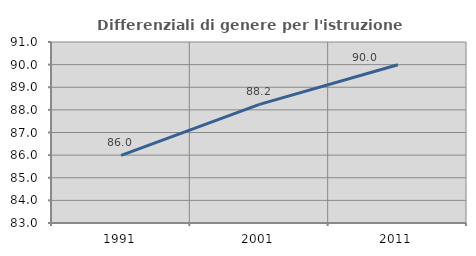
| Category | Differenziali di genere per l'istruzione superiore |
|---|---|
| 1991.0 | 85.987 |
| 2001.0 | 88.242 |
| 2011.0 | 89.992 |